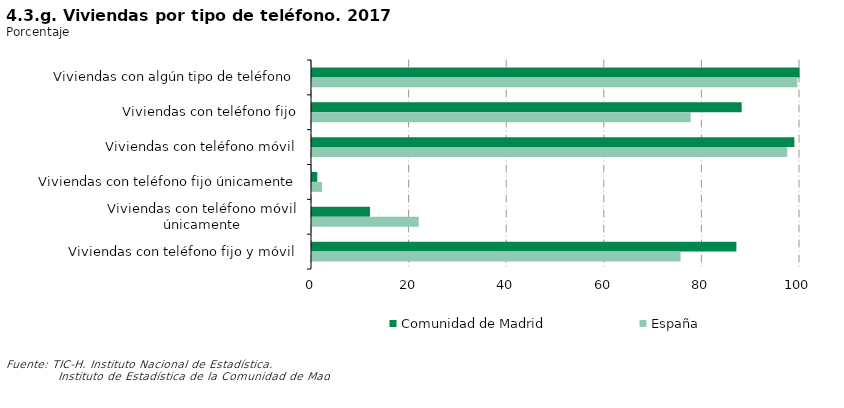
| Category | Comunidad de Madrid | España |
|---|---|---|
| Viviendas con algún tipo de teléfono | 99.928 | 99.453 |
| Viviendas con teléfono fijo | 88.051 | 77.583 |
| Viviendas con teléfono móvil | 98.844 | 97.401 |
| Viviendas con teléfono fijo únicamente | 1.084 | 2.053 |
| Viviendas con teléfono móvil únicamente | 11.877 | 21.87 |
| Viviendas con teléfono fijo y móvil | 86.967 | 75.53 |